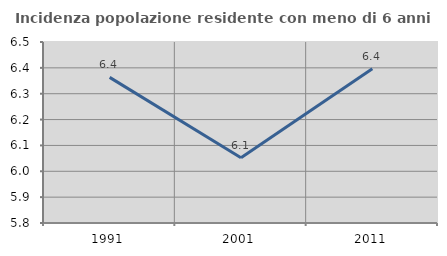
| Category | Incidenza popolazione residente con meno di 6 anni |
|---|---|
| 1991.0 | 6.363 |
| 2001.0 | 6.052 |
| 2011.0 | 6.396 |